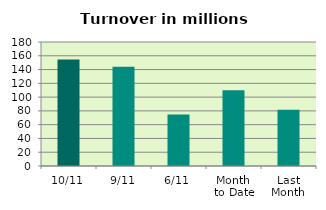
| Category | Series 0 |
|---|---|
| 10/11 | 154.771 |
| 9/11 | 144.158 |
| 6/11 | 74.682 |
| Month 
to Date | 110.099 |
| Last
Month | 81.795 |